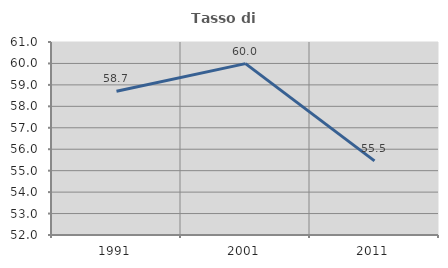
| Category | Tasso di occupazione   |
|---|---|
| 1991.0 | 58.703 |
| 2001.0 | 59.992 |
| 2011.0 | 55.455 |